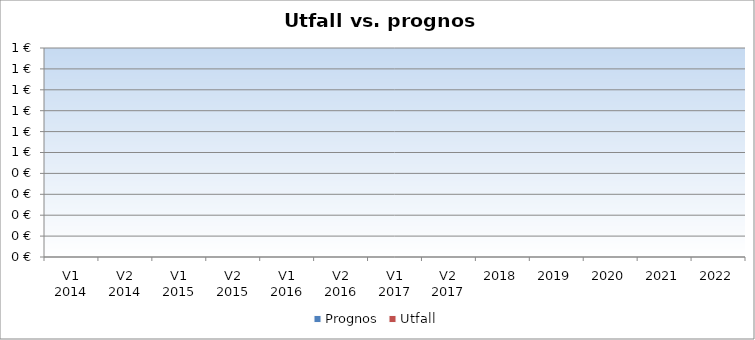
| Category | Prognos | Utfall |
|---|---|---|
| V1 2014 | 0 | 0 |
| V2 2014 | 0 | 0 |
| V1 2015 | 0 | 0 |
| V2 2015 | 0 | 0 |
| V1 2016 | 0 | 0 |
| V2 2016 | 0 | 0 |
| V1 2017 | 0 | 0 |
| V2 2017 | 0 | 0 |
| 2018 | 0 | 0 |
| 2019 | 0 | 0 |
| 2020 | 0 | 0 |
| 2021 | 0 | 0 |
| 2022 | 0 | 0 |